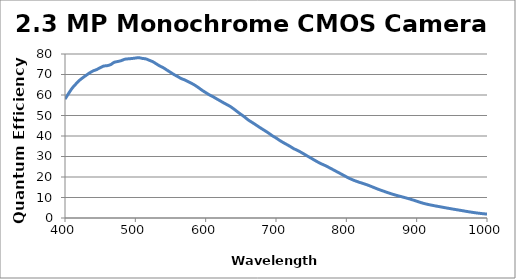
| Category | Quantum Efficiency (%) |
|---|---|
| 400.0 | 57.976 |
| 405.0 | 60.68 |
| 410.0 | 63.231 |
| 415.0 | 65.194 |
| 420.0 | 66.979 |
| 425.0 | 68.355 |
| 430.0 | 69.582 |
| 435.0 | 70.773 |
| 440.0 | 71.748 |
| 445.0 | 72.407 |
| 450.0 | 73.317 |
| 455.0 | 74.117 |
| 460.0 | 74.303 |
| 465.0 | 74.84 |
| 470.0 | 75.947 |
| 475.0 | 76.333 |
| 480.0 | 76.769 |
| 485.0 | 77.444 |
| 490.0 | 77.646 |
| 495.0 | 77.794 |
| 500.0 | 78.016 |
| 505.0 | 78.19 |
| 510.0 | 77.844 |
| 515.0 | 77.61 |
| 520.0 | 76.915 |
| 525.0 | 76.204 |
| 530.0 | 75.145 |
| 535.0 | 74.104 |
| 540.0 | 73.253 |
| 545.0 | 72.142 |
| 550.0 | 71.058 |
| 555.0 | 69.971 |
| 560.0 | 69.038 |
| 565.0 | 68.049 |
| 570.0 | 67.39 |
| 575.0 | 66.546 |
| 580.0 | 65.678 |
| 585.0 | 64.7 |
| 590.0 | 63.534 |
| 595.0 | 62.295 |
| 600.0 | 61.195 |
| 605.0 | 60.132 |
| 610.0 | 59.244 |
| 615.0 | 58.25 |
| 620.0 | 57.268 |
| 625.0 | 56.278 |
| 630.0 | 55.346 |
| 635.0 | 54.395 |
| 640.0 | 53.174 |
| 645.0 | 51.865 |
| 650.0 | 50.594 |
| 655.0 | 49.365 |
| 660.0 | 47.966 |
| 665.0 | 46.839 |
| 670.0 | 45.755 |
| 675.0 | 44.606 |
| 680.0 | 43.483 |
| 685.0 | 42.415 |
| 690.0 | 41.287 |
| 695.0 | 40.072 |
| 700.0 | 39.067 |
| 705.0 | 37.891 |
| 710.0 | 36.86 |
| 715.0 | 35.905 |
| 720.0 | 34.938 |
| 725.0 | 33.875 |
| 730.0 | 33.061 |
| 735.0 | 32.167 |
| 740.0 | 31.162 |
| 745.0 | 30.152 |
| 750.0 | 29.171 |
| 755.0 | 28.154 |
| 760.0 | 27.2 |
| 765.0 | 26.338 |
| 770.0 | 25.566 |
| 775.0 | 24.695 |
| 780.0 | 23.787 |
| 785.0 | 22.863 |
| 790.0 | 21.956 |
| 795.0 | 21.019 |
| 800.0 | 20.097 |
| 805.0 | 19.232 |
| 810.0 | 18.479 |
| 815.0 | 17.831 |
| 820.0 | 17.25 |
| 825.0 | 16.706 |
| 830.0 | 16.12 |
| 835.0 | 15.45 |
| 840.0 | 14.747 |
| 845.0 | 14.069 |
| 850.0 | 13.438 |
| 855.0 | 12.842 |
| 860.0 | 12.251 |
| 865.0 | 11.68 |
| 870.0 | 11.172 |
| 875.0 | 10.7 |
| 880.0 | 10.242 |
| 885.0 | 9.781 |
| 890.0 | 9.299 |
| 895.0 | 8.756 |
| 900.0 | 8.191 |
| 905.0 | 7.632 |
| 910.0 | 7.129 |
| 915.0 | 6.702 |
| 920.0 | 6.334 |
| 925.0 | 5.996 |
| 930.0 | 5.68 |
| 935.0 | 5.37 |
| 940.0 | 5.049 |
| 945.0 | 4.74 |
| 950.0 | 4.437 |
| 955.0 | 4.147 |
| 960.0 | 3.861 |
| 965.0 | 3.57 |
| 970.0 | 3.275 |
| 975.0 | 2.99 |
| 980.0 | 2.719 |
| 985.0 | 2.472 |
| 990.0 | 2.26 |
| 995.0 | 2.065 |
| 1000.0 | 1.907 |